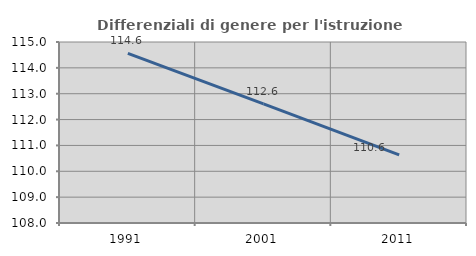
| Category | Differenziali di genere per l'istruzione superiore |
|---|---|
| 1991.0 | 114.558 |
| 2001.0 | 112.606 |
| 2011.0 | 110.635 |